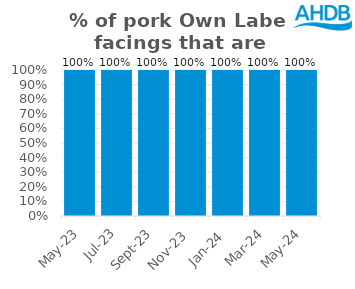
| Category | Series 2 |
|---|---|
| 2023-05-01 | 1 |
| 2023-07-01 | 1 |
| 2023-09-01 | 1 |
| 2023-11-01 | 1 |
| 2024-01-01 | 1 |
| 2024-03-01 | 1 |
| 2024-05-01 | 1 |